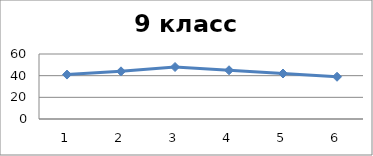
| Category | Series 0 |
|---|---|
| 0 | 41 |
| 1 | 44 |
| 2 | 48 |
| 3 | 45 |
| 4 | 42 |
| 5 | 39 |